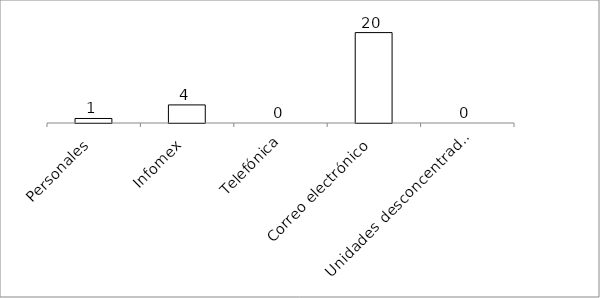
| Category | Series 0 |
|---|---|
| Personales | 1 |
| Infomex | 4 |
| Telefónica | 0 |
| Correo electrónico | 20 |
| Unidades desconcentradas | 0 |